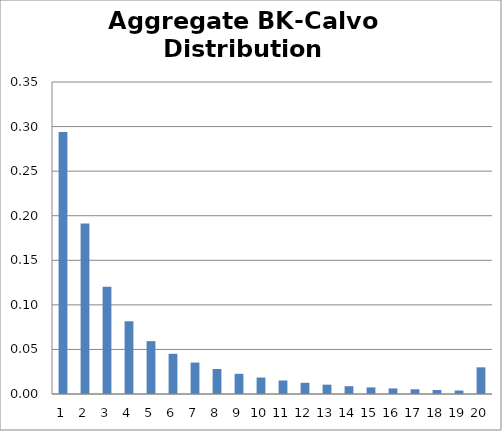
| Category | Series 0 |
|---|---|
| 0 | 0.294 |
| 1 | 0.191 |
| 2 | 0.12 |
| 3 | 0.082 |
| 4 | 0.059 |
| 5 | 0.045 |
| 6 | 0.035 |
| 7 | 0.028 |
| 8 | 0.023 |
| 9 | 0.018 |
| 10 | 0.015 |
| 11 | 0.013 |
| 12 | 0.01 |
| 13 | 0.009 |
| 14 | 0.007 |
| 15 | 0.006 |
| 16 | 0.005 |
| 17 | 0.005 |
| 18 | 0.004 |
| 19 | 0.03 |